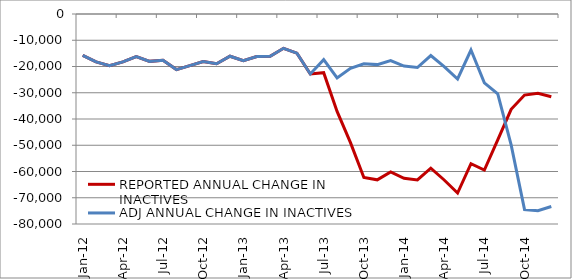
| Category | REPORTED ANNUAL CHANGE IN INACTIVES | ADJ ANNUAL CHANGE IN INACTIVES |
|---|---|---|
| 2012-01-01 | -15758 | -15758 |
| 2012-02-01 | -18247 | -18247 |
| 2012-03-01 | -19702 | -19702 |
| 2012-04-01 | -18218 | -18218 |
| 2012-05-01 | -16223 | -16223 |
| 2012-06-01 | -18041 | -18041 |
| 2012-07-01 | -17648 | -17648 |
| 2012-08-01 | -21176 | -21176 |
| 2012-09-01 | -19670 | -19670 |
| 2012-10-01 | -18125 | -18125 |
| 2012-11-01 | -18937 | -18937 |
| 2012-12-01 | -16092 | -16092 |
| 2013-01-01 | -17801 | -17801 |
| 2013-02-01 | -16205 | -16205 |
| 2013-03-01 | -16137 | -16137 |
| 2013-04-01 | -13079 | -13079 |
| 2013-05-01 | -14904 | -14904 |
| 2013-06-01 | -22835 | -22835 |
| 2013-07-01 | -22354 | -17401 |
| 2013-08-01 | -37123 | -24358 |
| 2013-09-01 | -48996 | -20685 |
| 2013-10-01 | -62296 | -18958 |
| 2013-11-01 | -63179 | -19284 |
| 2013-12-01 | -60149 | -17715.333 |
| 2014-01-01 | -62572 | -19853.333 |
| 2014-02-01 | -63224 | -20381.333 |
| 2014-03-01 | -58744 | -15836.333 |
| 2014-04-01 | -63234 | -20042.333 |
| 2014-05-01 | -68191 | -24759.333 |
| 2014-06-01 | -57038 | -13731.833 |
| 2014-07-01 | -59439 | -26236.333 |
| 2014-08-01 | -47943 | -30425.333 |
| 2014-09-01 | -36302 | -49876.333 |
| 2014-10-01 | -30880 | -74508.333 |
| 2014-11-01 | -30203 | -74945.333 |
| 2014-12-01 | -31535 | -73354.667 |